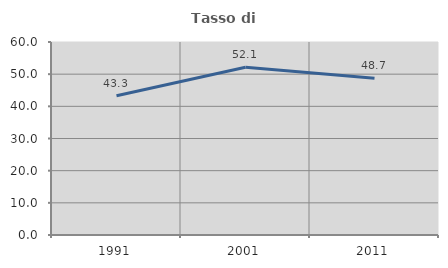
| Category | Tasso di occupazione   |
|---|---|
| 1991.0 | 43.287 |
| 2001.0 | 52.133 |
| 2011.0 | 48.705 |